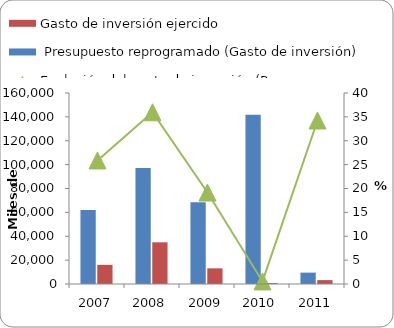
| Category |  Presupuesto reprogramado (Gasto de inversión) | Gasto de inversión ejercido |
|---|---|---|
| 2007 | 61962 | 16034 |
| 2008 | 97082 | 34913 |
| 2009 | 68514 | 13121 |
| 2010 | 141828 | 763 |
| 2011 | 9529 | 3263 |